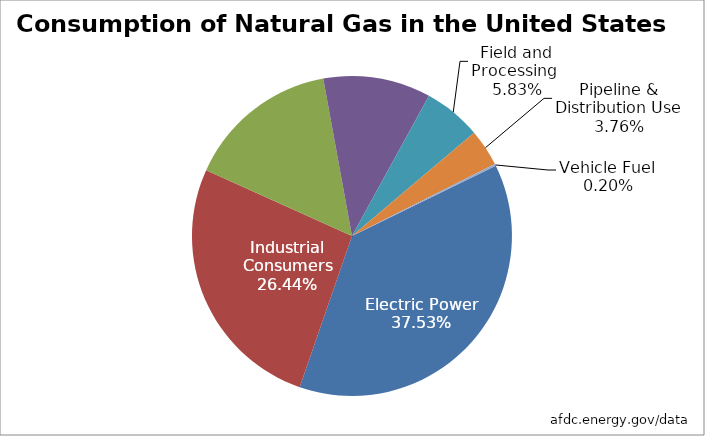
| Category | Series 0 |
|---|---|
| Electric Power | 12117975 |
| Industrial Consumers | 8536882 |
| Residential Consumers | 4964165 |
| Commercial Consumers | 3509075 |
| Field and Processing  | 1882802 |
| Pipeline & Distribution Use | 1212338 |
| Vehicle Fuel | 64994 |